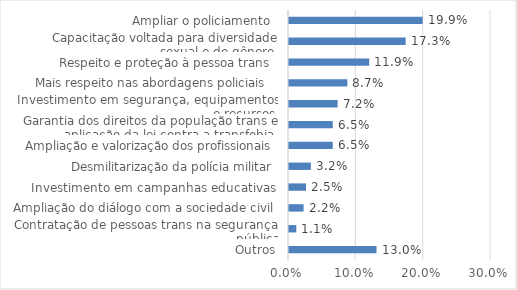
| Category | Series 0 |
|---|---|
| Outros | 0.13 |
| Contratação de pessoas trans na segurança pública | 0.011 |
| Ampliação do diálogo com a sociedade civil | 0.022 |
| Investimento em campanhas educativas | 0.025 |
| Desmilitarização da polícia militar | 0.032 |
| Ampliação e valorização dos profissionais | 0.065 |
| Garantia dos direitos da população trans e aplicação da lei contra a transfobia  | 0.065 |
| Investimento em segurança, equipamentos e recursos  | 0.072 |
| Mais respeito nas abordagens policiais   | 0.087 |
| Respeito e proteção à pessoa trans  | 0.119 |
| Capacitação voltada para diversidade sexual e de gênero  | 0.173 |
| Ampliar o policiamento  | 0.199 |